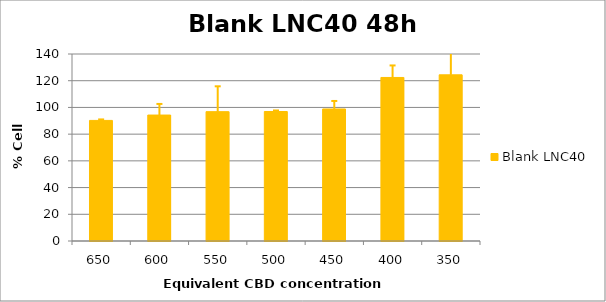
| Category | Blank LNC40 |
|---|---|
| 650.0 | 90.278 |
| 600.0 | 94.286 |
| 550.0 | 96.833 |
| 500.0 | 96.935 |
| 450.0 | 98.85 |
| 400.0 | 122.433 |
| 350.0 | 124.411 |